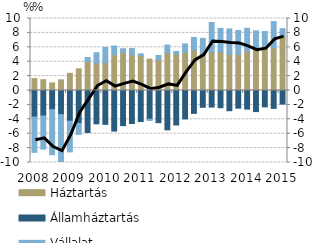
| Category | Háztartás | Államháztartás | Vállalat |
|---|---|---|---|
| 2008.0 | 1.667 | -3.681 | -4.907 |
| 2008.0 | 1.498 | -3.534 | -4.607 |
| 2008.0 | 1.055 | -2.654 | -6.26 |
| 2008.0 | 1.484 | -3.352 | -6.548 |
| 2009.0 | 2.381 | -4.26 | -4.266 |
| 2009.0 | 3.007 | -4.572 | -1.528 |
| 2009.0 | 3.999 | -5.832 | 0.59 |
| 2009.0 | 3.816 | -4.628 | 1.431 |
| 2010.0 | 3.85 | -4.7 | 2.133 |
| 2010.0 | 4.974 | -5.635 | 1.197 |
| 2010.0 | 5.235 | -4.88 | 0.559 |
| 2010.0 | 4.955 | -4.585 | 0.88 |
| 2011.0 | 4.83 | -4.31 | 0.265 |
| 2011.0 | 4.35 | -3.993 | -0.177 |
| 2011.0 | 4.26 | -4.467 | 0.596 |
| 2011.0 | 5.201 | -5.465 | 1.111 |
| 2012.0 | 5.065 | -4.789 | 0.359 |
| 2012.0 | 5.265 | -3.948 | 1.206 |
| 2012.0 | 5.638 | -3.177 | 1.729 |
| 2012.0 | 5.213 | -2.33 | 2.024 |
| 2013.0 | 5.33 | -2.302 | 4.112 |
| 2013.0 | 5.384 | -2.394 | 3.242 |
| 2013.0 | 5.046 | -2.81 | 3.505 |
| 2013.0 | 5.027 | -2.453 | 3.315 |
| 2014.0 | 5.464 | -2.583 | 3.179 |
| 2014.0 | 5.635 | -2.93 | 2.649 |
| 2014.0 | 5.924 | -2.274 | 2.264 |
| 2014.0 | 5.946 | -2.482 | 3.62 |
| 2015.0 | 7.507 | -1.889 | 1.079 |